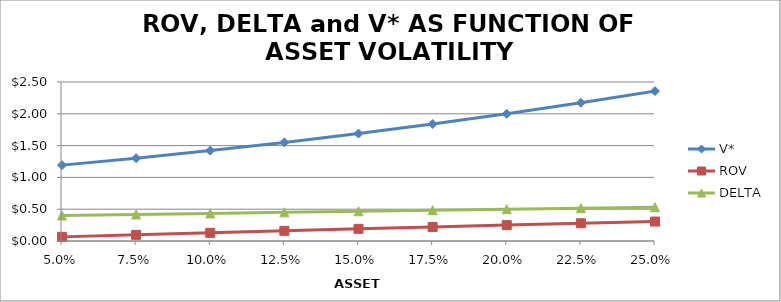
| Category | V* | ROV | DELTA |
|---|---|---|---|
| 0.05 | 1.193 | 0.065 | 0.401 |
| 0.07500000000000001 | 1.303 | 0.097 | 0.417 |
| 0.1 | 1.422 | 0.129 | 0.434 |
| 0.125 | 1.55 | 0.16 | 0.451 |
| 0.15 | 1.689 | 0.191 | 0.467 |
| 0.175 | 1.839 | 0.221 | 0.484 |
| 0.19999999999999998 | 2 | 0.25 | 0.5 |
| 0.22499999999999998 | 2.173 | 0.278 | 0.516 |
| 0.24999999999999997 | 2.357 | 0.306 | 0.532 |